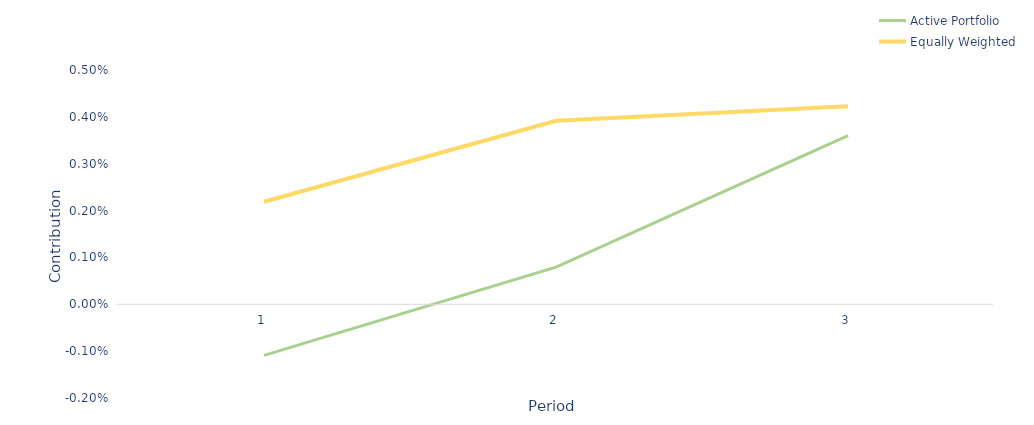
| Category | Active Portfolio | Equally Weighted |
|---|---|---|
| 0 | -0.001 | 0.002 |
| 1 | 0.001 | 0.004 |
| 2 | 0.004 | 0.004 |